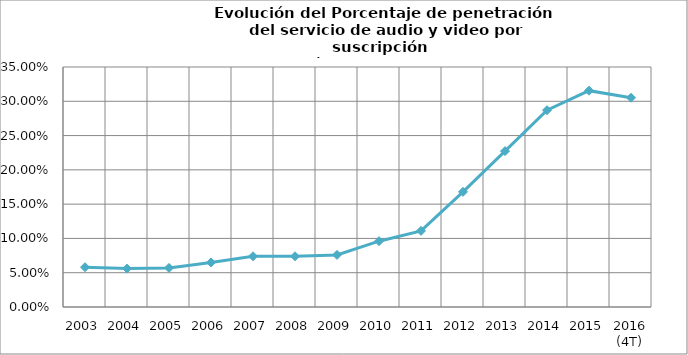
| Category | Grado estimado de penetración del servicio |
|---|---|
| 2003 | 0.058 |
| 2004 | 0.056 |
| 2005 | 0.057 |
| 2006 | 0.065 |
| 2007 | 0.074 |
| 2008 | 0.074 |
| 2009 | 0.076 |
| 2010 | 0.096 |
| 2011 | 0.111 |
| 2012 | 0.168 |
| 2013 | 0.227 |
| 2014 | 0.287 |
| 2015 | 0.315 |
| 2016 (4T) | 0.305 |